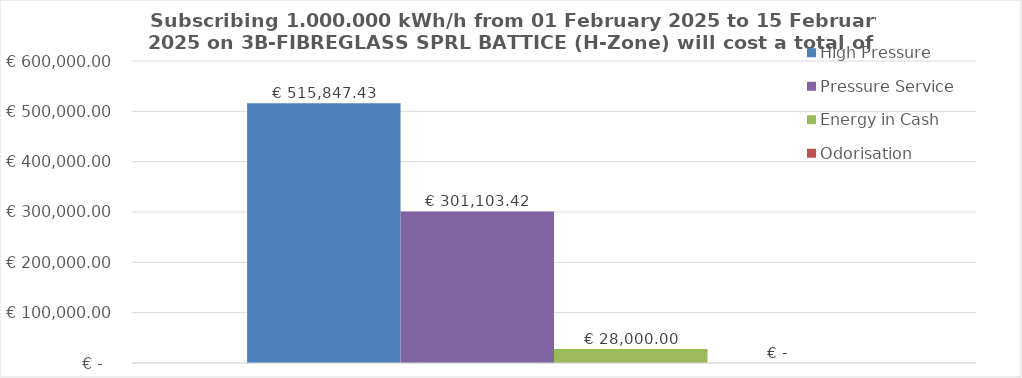
| Category | High Pressure | Pressure Service | Energy in Cash  | Odorisation |
|---|---|---|---|---|
|  | 515847.432 | 301103.425 | 28000 | 0 |